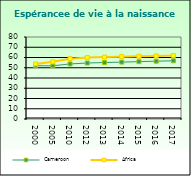
| Category | Cameroon | Africa                        |
|---|---|---|
| 2000.0 | 51.96 | 53.721 |
| 2005.0 | 51.912 | 55.757 |
| 2010.0 | 53.718 | 58.857 |
| 2012.0 | 54.61 | 59.91 |
| 2013.0 | 55.065 | 60.376 |
| 2014.0 | 55.516 | 60.801 |
| 2015.0 | 55.958 | 61.187 |
| 2016.0 | 56.388 | 61.538 |
| 2017.0 | 56.809 | 61.865 |